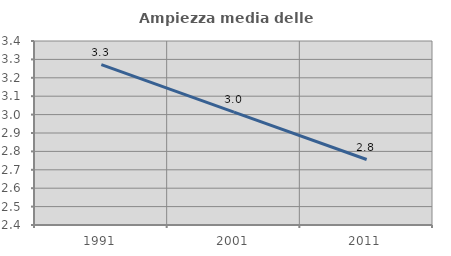
| Category | Ampiezza media delle famiglie |
|---|---|
| 1991.0 | 3.271 |
| 2001.0 | 3.014 |
| 2011.0 | 2.756 |